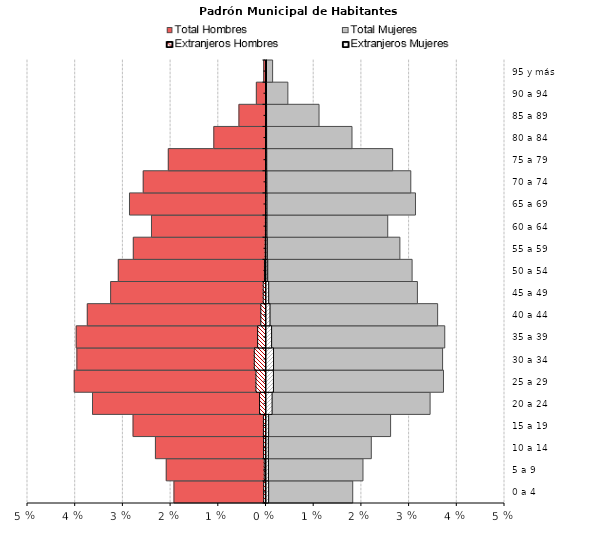
| Category | Total Hombres | Total Mujeres | Extranjeros Hombres | Extranjeros Mujeres |
|---|---|---|---|---|
| 0 a 4 | -0.019 | 0.018 | 0 | 0 |
| 5 a 9 | -0.021 | 0.02 | 0 | 0 |
| 10 a 14 | -0.023 | 0.022 | -0.001 | 0 |
| 15 a 19 | -0.028 | 0.026 | -0.001 | 0 |
| 20 a 24 | -0.036 | 0.034 | -0.001 | 0.001 |
| 25 a 29 | -0.04 | 0.037 | -0.002 | 0.001 |
| 30 a 34 | -0.04 | 0.037 | -0.002 | 0.001 |
| 35 a 39 | -0.04 | 0.037 | -0.002 | 0.001 |
| 40 a 44 | -0.037 | 0.036 | -0.001 | 0.001 |
| 45 a 49 | -0.033 | 0.032 | -0.001 | 0 |
| 50 a 54 | -0.031 | 0.031 | 0 | 0 |
| 55 a 59 | -0.028 | 0.028 | 0 | 0 |
| 60 a 64 | -0.024 | 0.025 | 0 | 0 |
| 65 a 69 | -0.029 | 0.031 | 0 | 0 |
| 70 a 74 | -0.026 | 0.03 | 0 | 0 |
| 75 a 79 | -0.02 | 0.026 | 0 | 0 |
| 80 a 84 | -0.011 | 0.018 | 0 | 0 |
| 85 a 89 | -0.006 | 0.011 | 0 | 0 |
| 90 a 94 | -0.002 | 0.004 | 0 | 0 |
| 95 y más | 0 | 0.001 | 0 | 0 |